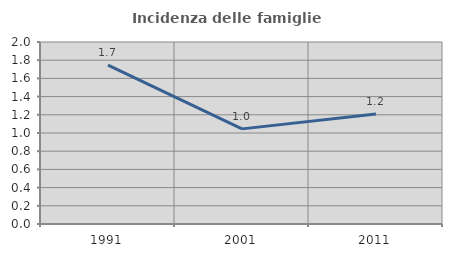
| Category | Incidenza delle famiglie numerose |
|---|---|
| 1991.0 | 1.745 |
| 2001.0 | 1.045 |
| 2011.0 | 1.208 |